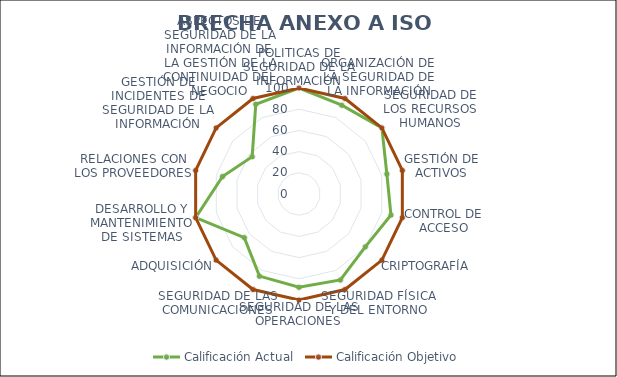
| Category | Calificación Actual | Calificación Objetivo |
|---|---|---|
| 0 | 100 | 100 |
| 1 | 93 | 100 |
| 2 | 100 | 100 |
| 3 | 85 | 100 |
| 4 | 89 | 100 |
| 5 | 80 | 100 |
| 6 | 90 | 100 |
| 7 | 88 | 100 |
| 8 | 86 | 100 |
| 9 | 66 | 100 |
| 10 | 100 | 100 |
| 11 | 74 | 100 |
| 12 | 56.5 | 100 |
| 13 | 94 | 100 |